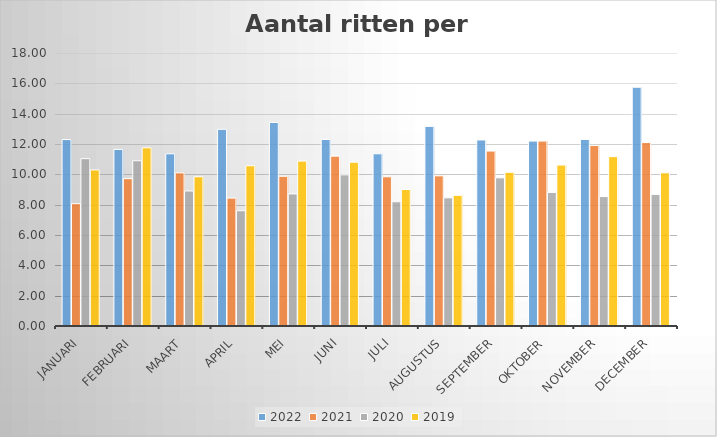
| Category | 2022 | 2021 | 2020 | 2019 |
|---|---|---|---|---|
| januari | 12.29 | 8.065 | 11.032 | 10.29 |
| februari | 11.643 | 9.714 | 10.897 | 11.75 |
| maart | 11.355 | 10.097 | 8.903 | 9.839 |
| april | 12.967 | 8.433 | 7.6 | 10.567 |
| mei | 13.419 | 9.871 | 8.71 | 10.871 |
| juni | 12.3 | 11.2 | 9.967 | 10.8 |
| juli | 11.355 | 9.839 | 8.194 | 9 |
| augustus | 13.161 | 9.903 | 8.452 | 8.613 |
| september | 12.267 | 11.533 | 9.767 | 10.133 |
| oktober | 12.194 | 12.194 | 8.806 | 10.613 |
| november | 12.3 | 11.9 | 8.533 | 11.167 |
| december | 15.742 | 12.097 | 8.677 | 10.097 |